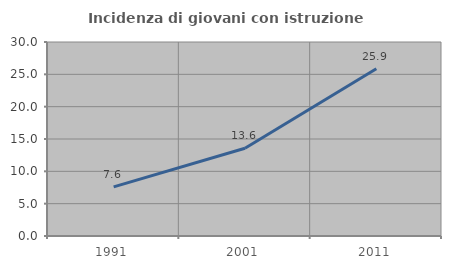
| Category | Incidenza di giovani con istruzione universitaria |
|---|---|
| 1991.0 | 7.589 |
| 2001.0 | 13.561 |
| 2011.0 | 25.85 |